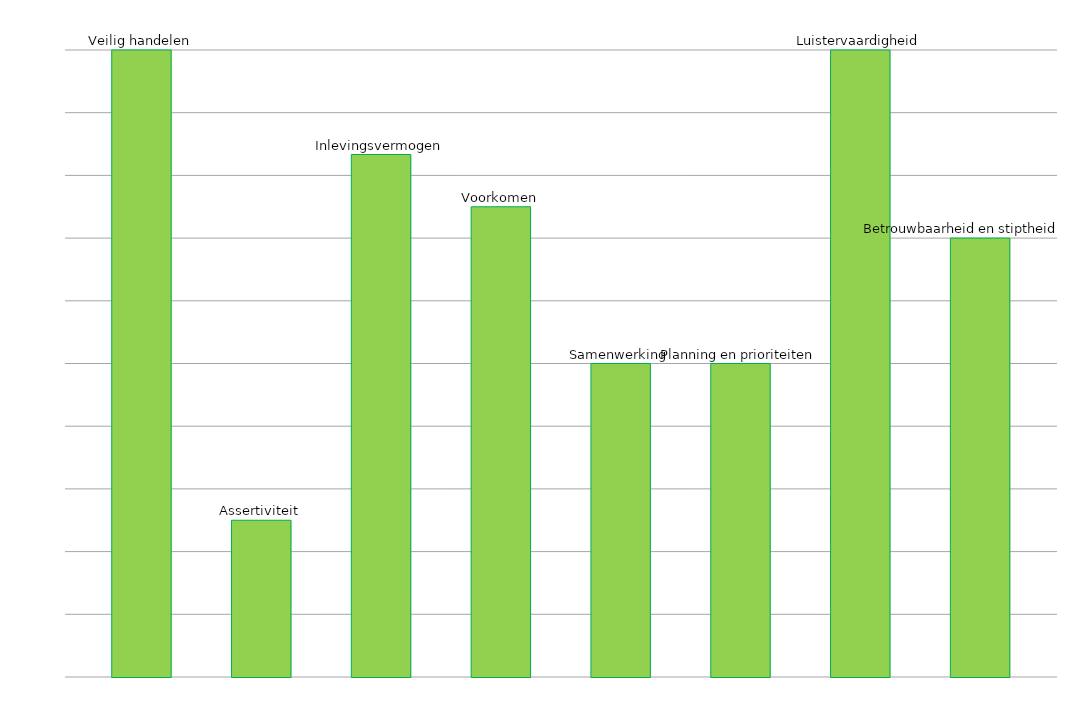
| Category | Veilig handelen | Assertiviteit | Inlevingsvermogen | Voorkomen | Samenwerking | Planning en prioriteiten | Luistervaardigheid | Betrouwbaarheid en stiptheid |
|---|---|---|---|---|---|---|---|---|
| 0 | 5 | 1.25 | 4.167 | 3.75 | 2.5 | 2.5 | 5 | 3.5 |